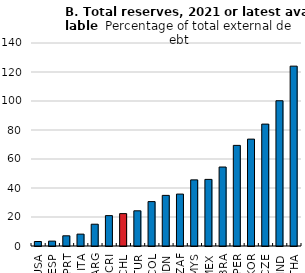
| Category | Reserve/Total external debt, Nov-21 or latest |
|---|---|
| USA | 3.101 |
| ESP | 3.371 |
| PRT | 7.036 |
| ITA | 8.188 |
| ARG | 15.029 |
| CRI | 20.958 |
| CHL | 22.336 |
| TUR | 24.271 |
| COL | 30.619 |
| IDN | 34.912 |
| ZAF | 35.798 |
| MYS | 45.608 |
| MEX | 45.933 |
| BRA | 54.467 |
| PER | 69.387 |
| KOR | 73.716 |
| CZE | 84.072 |
| IND | 100.177 |
| THA | 124.035 |